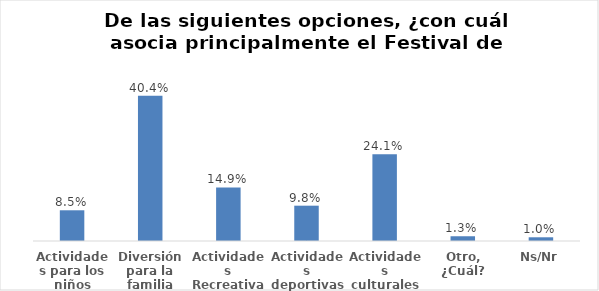
| Category | Series 0 |
|---|---|
| Actividades para los niños | 0.085 |
| Diversión para la familia | 0.404 |
| Actividades Recreativas | 0.149 |
| Actividades deportivas | 0.098 |
| Actividades culturales | 0.241 |
| Otro, ¿Cuál? | 0.013 |
| Ns/Nr | 0.01 |